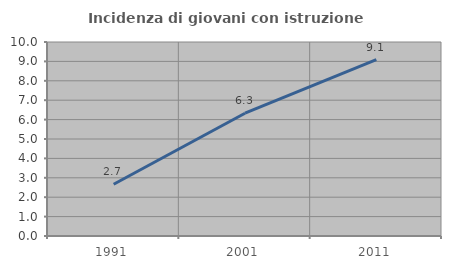
| Category | Incidenza di giovani con istruzione universitaria |
|---|---|
| 1991.0 | 2.667 |
| 2001.0 | 6.329 |
| 2011.0 | 9.091 |